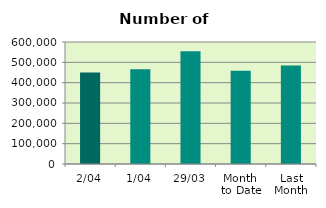
| Category | Series 0 |
|---|---|
| 2/04 | 449528 |
| 1/04 | 466466 |
| 29/03 | 554446 |
| Month 
to Date | 457997 |
| Last
Month | 483948.286 |